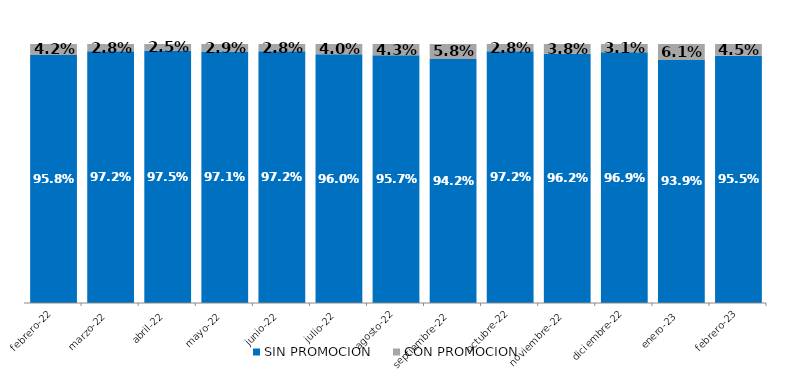
| Category | SIN PROMOCION   | CON PROMOCION   |
|---|---|---|
| 2022-02-01 | 0.958 | 0.042 |
| 2022-03-01 | 0.972 | 0.028 |
| 2022-04-01 | 0.975 | 0.025 |
| 2022-05-01 | 0.971 | 0.029 |
| 2022-06-01 | 0.972 | 0.028 |
| 2022-07-01 | 0.96 | 0.04 |
| 2022-08-01 | 0.957 | 0.043 |
| 2022-09-01 | 0.942 | 0.058 |
| 2022-10-01 | 0.972 | 0.028 |
| 2022-11-01 | 0.962 | 0.038 |
| 2022-12-01 | 0.969 | 0.031 |
| 2023-01-01 | 0.939 | 0.061 |
| 2023-02-01 | 0.955 | 0.045 |